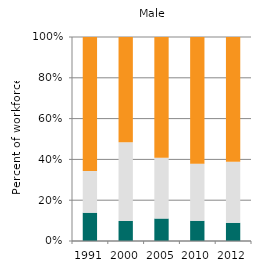
| Category | Agriculture | Industry | Services |
|---|---|---|---|
| 1991.0 | 13.865 | 20.434 | 65.7 |
| 2000.0 | 9.832 | 38.628 | 51.54 |
| 2005.0 | 11.021 | 29.796 | 59.183 |
| 2010.0 | 9.922 | 27.998 | 62.08 |
| 2012.0 | 8.923 | 29.896 | 61.181 |